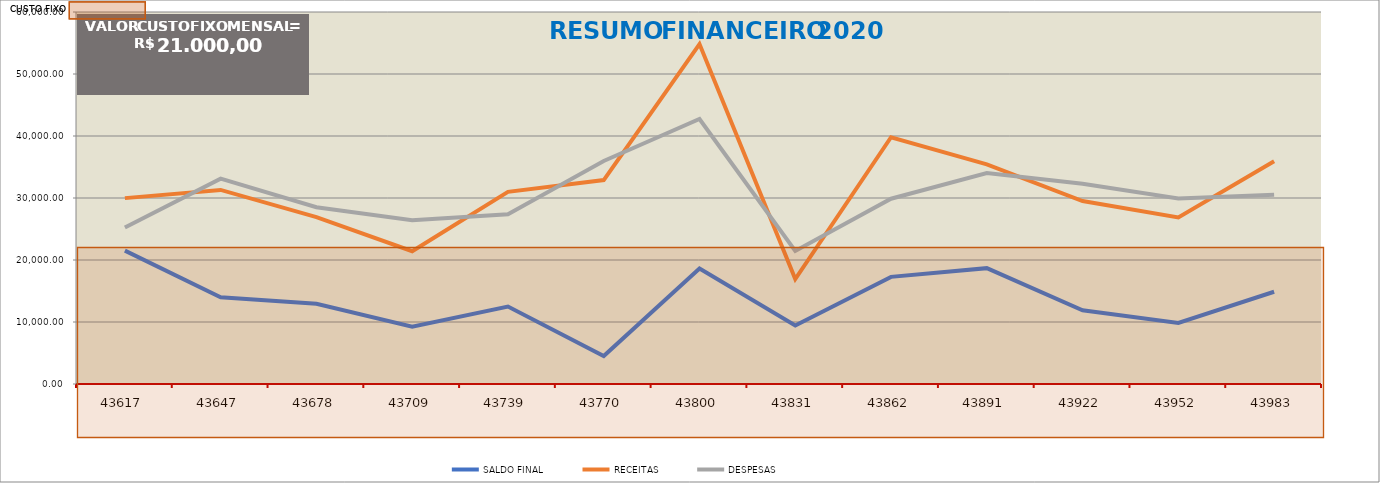
| Category | SALDO FINAL | RECEITAS | DESPESAS  |
|---|---|---|---|
| 2019-06-01 | 21512.03 | 29978.91 | 25250.15 |
| 2019-07-01 | 13981.22 | 31304.34 | 33125.23 |
| 2019-08-01 | 12933.783 | 26922.33 | 28505.79 |
| 2019-09-01 | 9245.85 | 21419.21 | 26406.64 |
| 2019-10-01 | 12493.23 | 30988.87 | 27393.25 |
| 2019-11-01 | 4506.97 | 32892.83 | 35979.09 |
| 2019-12-01 | 18643.56 | 54826.07 | 42739.48 |
| 2020-01-01 | 9428.91 | 16929.55 | 21447.62 |
| 2020-02-01 | 17281.1 | 39797.87 | 29885.68 |
| 2020-03-01 | 18686.55 | 35423.6 | 34018.15 |
| 2020-04-01 | 11892.77 | 29509.2 | 32302.98 |
| 2020-05-01 | 9839.7 | 26864.6 | 29917.67 |
| 2020-06-01 | 14882.45 | 35923.79 | 30508.56 |